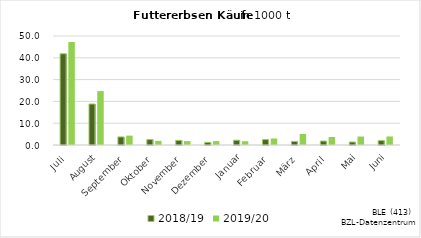
| Category | 2018/19 | 2019/20 |
|---|---|---|
| Juli | 41.842 | 47.237 |
| August | 18.806 | 24.731 |
| September | 3.701 | 4.285 |
| Oktober | 2.478 | 1.896 |
| November | 2.129 | 1.786 |
| Dezember | 1.202 | 1.793 |
| Januar | 2.186 | 1.736 |
| Februar | 2.473 | 2.985 |
| März | 1.644 | 5.08 |
| April | 1.808 | 3.68 |
| Mai | 1.366 | 3.879 |
| Juni | 2.021 | 3.913 |